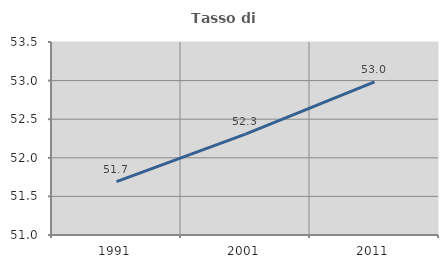
| Category | Tasso di occupazione   |
|---|---|
| 1991.0 | 51.692 |
| 2001.0 | 52.306 |
| 2011.0 | 52.984 |